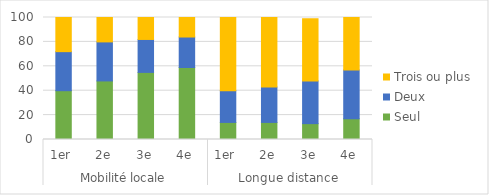
| Category | Seul | Deux | Trois ou plus |
|---|---|---|---|
| 0 | 40 | 32 | 28 |
| 1 | 48 | 32 | 20 |
| 2 | 55 | 27 | 18 |
| 3 | 59 | 25 | 16 |
| 4 | 14 | 26 | 61 |
| 5 | 14 | 29 | 57 |
| 6 | 13 | 35 | 51 |
| 7 | 17 | 40 | 43 |